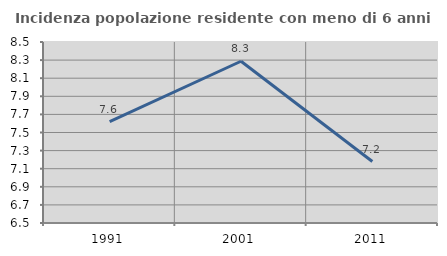
| Category | Incidenza popolazione residente con meno di 6 anni |
|---|---|
| 1991.0 | 7.619 |
| 2001.0 | 8.287 |
| 2011.0 | 7.179 |